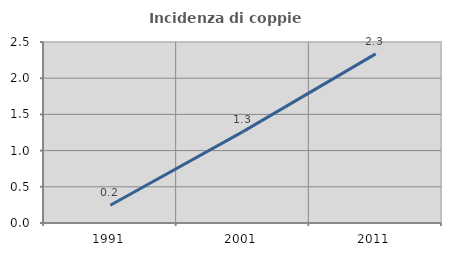
| Category | Incidenza di coppie miste |
|---|---|
| 1991.0 | 0.246 |
| 2001.0 | 1.262 |
| 2011.0 | 2.336 |